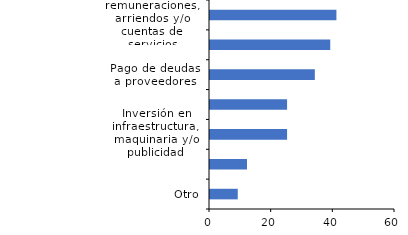
| Category | Series 0 |
|---|---|
| Otro | 9 |
| Adecuación debido a disposiciones sanitarias | 12 |
| Inversión en infraestructura, maquinaria y/o publicidad | 25 |
| Refinanciamiento de créditos anteriores | 25 |
| Pago de deudas a proveedores | 34 |
| Compra de insumos y/o materias primas | 39 |
| Pago de remuneraciones, arriendos y/o cuentas de servicios | 41 |